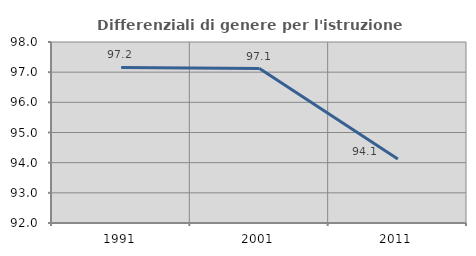
| Category | Differenziali di genere per l'istruzione superiore |
|---|---|
| 1991.0 | 97.156 |
| 2001.0 | 97.12 |
| 2011.0 | 94.125 |